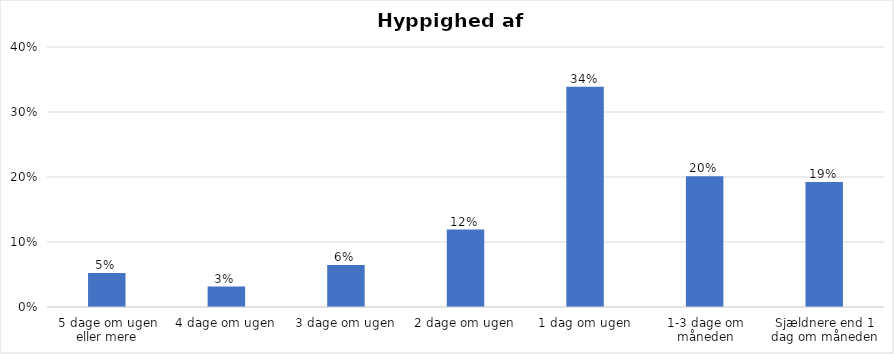
| Category | % |
|---|---|
| 5 dage om ugen eller mere | 0.052 |
| 4 dage om ugen | 0.031 |
| 3 dage om ugen | 0.065 |
| 2 dage om ugen | 0.119 |
| 1 dag om ugen | 0.339 |
| 1-3 dage om måneden | 0.201 |
| Sjældnere end 1 dag om måneden | 0.192 |